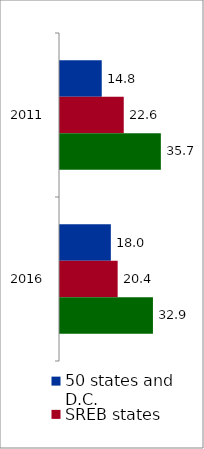
| Category | 50 states and D.C. | SREB states | State |
|---|---|---|---|
| 2011.0 | 14.774 | 22.566 | 35.7 |
| 2016.0 | 18.002 | 20.409 | 32.898 |